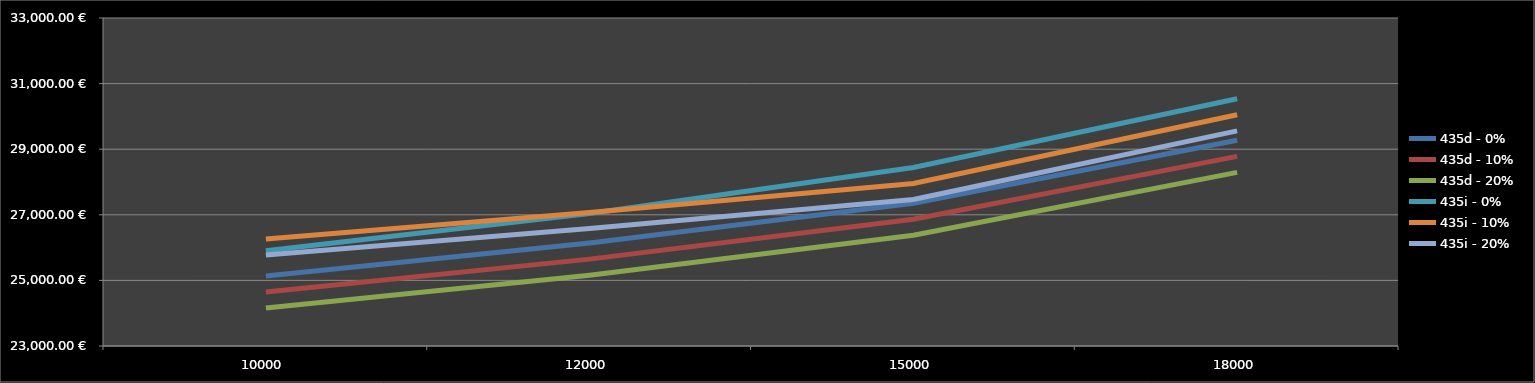
| Category | 435d - 0% | 435d - 10% | 435d - 20% | 435i - 0% | 435i - 10% | 435i - 20% |
|---|---|---|---|---|---|---|
| 10000.0 | 25133.49 | 24644.89 | 24156.3 | 25905.49 | 26259.89 | 25771.66 |
| 12000.0 | 26136.89 | 25648.29 | 25159.7 | 27040.49 | 27072.89 | 26584.66 |
| 15000.0 | 27352.24 | 26863.64 | 26375.05 | 28442.24 | 27953.64 | 27465.41 |
| 18000.0 | 29270.64 | 28782.04 | 28293.45 | 30537.04 | 30048.44 | 29560.21 |